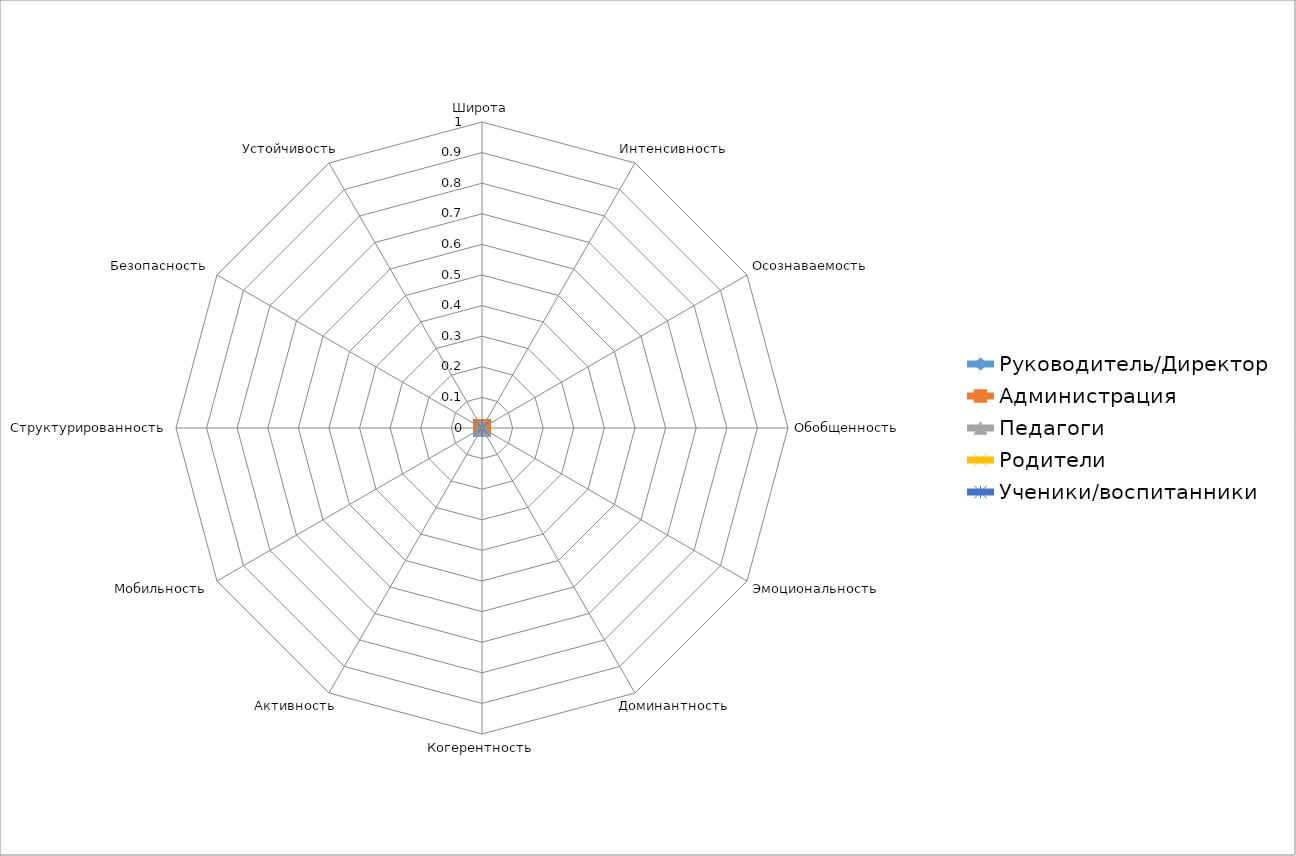
| Category | Руководитель/Директор | Администрация | Педагоги | Родители | Ученики/воспитанники |
|---|---|---|---|---|---|
| Широта | 0 | 0 | 0 | 0 | 0 |
| Интенсивность | 0 | 0 | 0 | 0 | 0 |
| Осознаваемость | 0 | 0 | 0 | 0 | 0 |
| Обобщенность | 0 | 0 | 0 | 0 | 0 |
| Эмоциональность | 0 | 0 | 0 | 0 | 0 |
| Доминантность | 0 | 0 | 0 | 0 | 0 |
| Когерентность | 0 | 0 | 0 | 0 | 0 |
| Активность | 0 | 0 | 0 | 0 | 0 |
| Мобильность | 0 | 0 | 0 | 0 | 0 |
| Структурированность | 0 | 0 | 0 | 0 | 0 |
| Безопасность | 0 | 0 | 0 | 0 | 0 |
| Устойчивость | 0 | 0 | 0 | 0 | 0 |